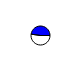
| Category | Series 0 |
|---|---|
| 0 | 3314022 |
| 1 | 3028705 |